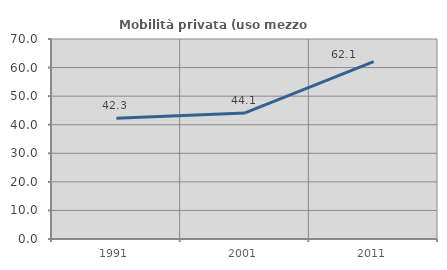
| Category | Mobilità privata (uso mezzo privato) |
|---|---|
| 1991.0 | 42.268 |
| 2001.0 | 44.118 |
| 2011.0 | 62.069 |